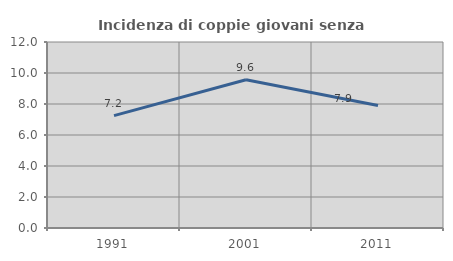
| Category | Incidenza di coppie giovani senza figli |
|---|---|
| 1991.0 | 7.25 |
| 2001.0 | 9.562 |
| 2011.0 | 7.903 |